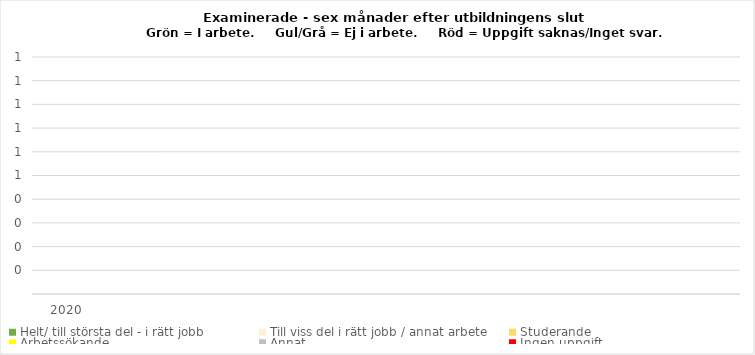
| Category | Helt/ till största del - i rätt jobb | Till viss del i rätt jobb / annat arbete | Studerande | Arbetssökande | Annat | Ingen uppgift |
|---|---|---|---|---|---|---|
| 2020.0 |  |  |  |  |  | 0 |
| 0.0 |  |  |  |  |  | 0 |
| 0.0 |  |  |  |  |  | 0 |
| 0.0 |  |  |  |  |  | 0 |
| 0.0 |  |  |  |  |  | 0 |
| 0.0 |  |  |  |  |  | 0 |
| 0.0 |  |  |  |  |  | 0 |
| 0.0 |  |  |  |  |  | 0 |
| 0.0 |  |  |  |  |  | 0 |
| 0.0 |  |  |  |  |  | 0 |